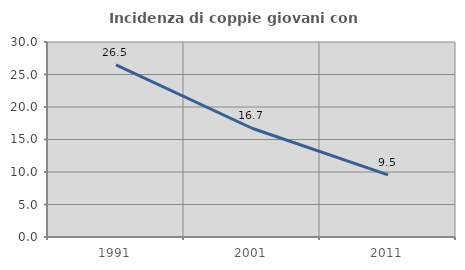
| Category | Incidenza di coppie giovani con figli |
|---|---|
| 1991.0 | 26.481 |
| 2001.0 | 16.732 |
| 2011.0 | 9.545 |